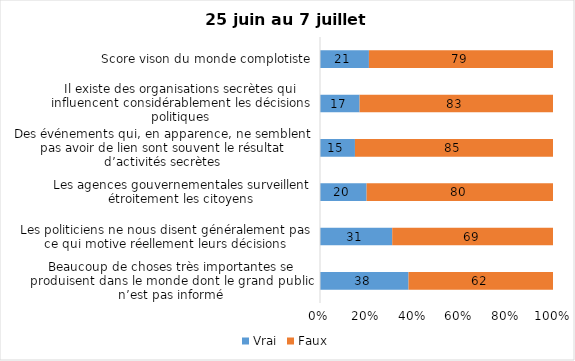
| Category | Vrai | Faux |
|---|---|---|
| Beaucoup de choses très importantes se produisent dans le monde dont le grand public n’est pas informé | 38 | 62 |
| Les politiciens ne nous disent généralement pas ce qui motive réellement leurs décisions | 31 | 69 |
| Les agences gouvernementales surveillent étroitement les citoyens | 20 | 80 |
| Des événements qui, en apparence, ne semblent pas avoir de lien sont souvent le résultat d’activités secrètes | 15 | 85 |
| Il existe des organisations secrètes qui influencent considérablement les décisions politiques | 17 | 83 |
| Score vison du monde complotiste | 21 | 79 |